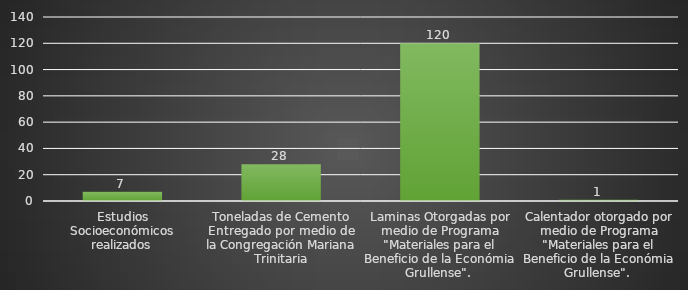
| Category | INDICADOR  |
|---|---|
| Estudios Socioeconómicos realizados | 7 |
| Toneladas de Cemento Entregado por medio de la Congregación Mariana Trinitaria | 28 |
| Laminas Otorgadas por medio de Programa "Materiales para el Beneficio de la Económia Grullense".  | 120 |
| Calentador otorgado por medio de Programa "Materiales para el Beneficio de la Económia Grullense".  | 1 |